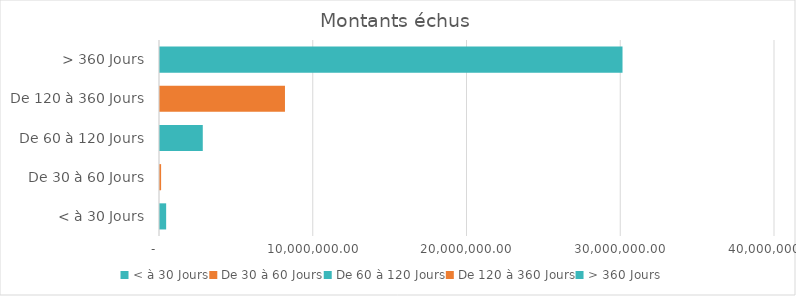
| Category | Montant |
|---|---|
| < à 30 Jours | 399947.38 |
| De 30 à 60 Jours | 71760 |
| De 60 à 120 Jours | 2782112.8 |
| De 120 à 360 Jours | 8128372.12 |
| > 360 Jours | 30082477.64 |